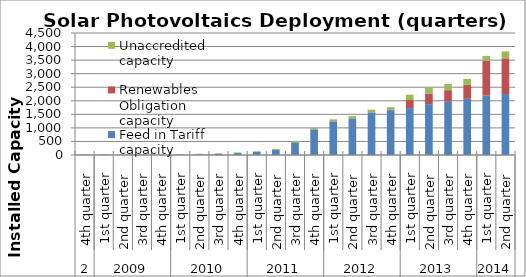
| Category | Feed in Tariff capacity | Renewables Obligation capacity | Unaccredited capacity |
|---|---|---|---|
| 0 | 7.229 | 1.93 | 14.67 |
| 1 | 7.854 | 1.935 | 14.67 |
| 2 | 8.63 | 1.964 | 14.67 |
| 3 | 10.21 | 1.987 | 14.6 |
| 4 | 12.178 | 2.074 | 14.6 |
| 5 | 15.875 | 2.108 | 15.067 |
| 6 | 26.923 | 2.159 | 16.527 |
| 7 | 44.179 | 2.191 | 18.499 |
| 8 | 69.544 | 2.225 | 21.121 |
| 9 | 110.633 | 2.242 | 24.24 |
| 10 | 184.421 | 2.321 | 31.618 |
| 11 | 467.969 | 2.421 | 37.261 |
| 12 | 942.967 | 7.25 | 47.885 |
| 13 | 1237.393 | 8.41 | 67.816 |
| 14 | 1347.444 | 8.656 | 81.4 |
| 15 | 1565.436 | 9.512 | 96.041 |
| 16 | 1650.429 | 11.54 | 101.758 |
| 17 | 1730.314 | 297.049 | 196.636 |
| 18 | 1875.524 | 388.678 | 224.252 |
| 19 | 1969.574 | 421.77 | 227.933 |
| 20 | 2074.956 | 516.711 | 212.978 |
| 21 | 2189.459 | 1282.71 | 183.02 |
| 22 | 2248.127 | 1318.419 | 256.873 |